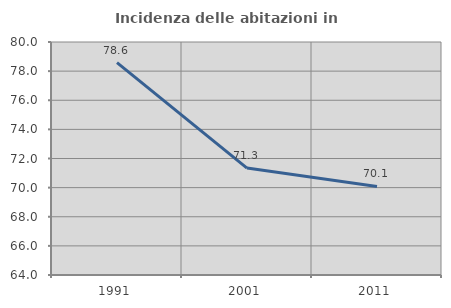
| Category | Incidenza delle abitazioni in proprietà  |
|---|---|
| 1991.0 | 78.584 |
| 2001.0 | 71.344 |
| 2011.0 | 70.083 |